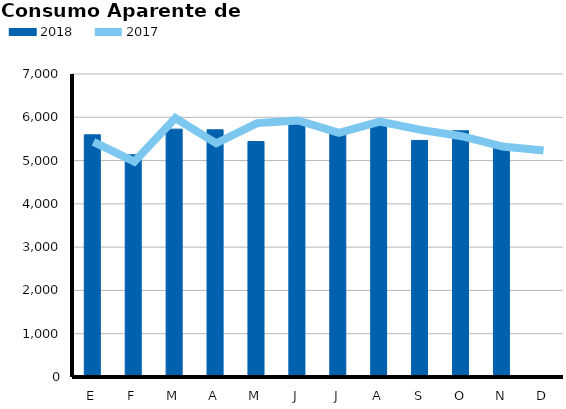
| Category | 2018 |
|---|---|
| E | 5593.778 |
| F | 5133.739 |
| M | 5726.312 |
| A | 5710.752 |
| M | 5438.563 |
| J | 5893.41 |
| J | 5645.561 |
| A | 5889.863 |
| S | 5465.715 |
| O | 5688.214 |
| N | 5355.371 |
| D | 0 |